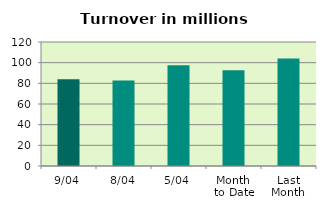
| Category | Series 0 |
|---|---|
| 9/04 | 83.971 |
| 8/04 | 82.666 |
| 5/04 | 97.518 |
| Month 
to Date | 92.562 |
| Last
Month | 104.085 |